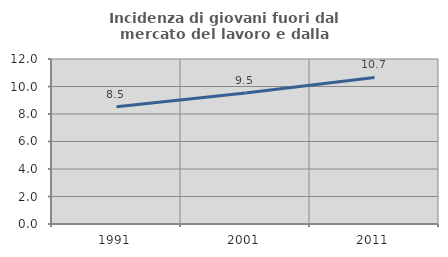
| Category | Incidenza di giovani fuori dal mercato del lavoro e dalla formazione  |
|---|---|
| 1991.0 | 8.527 |
| 2001.0 | 9.524 |
| 2011.0 | 10.656 |